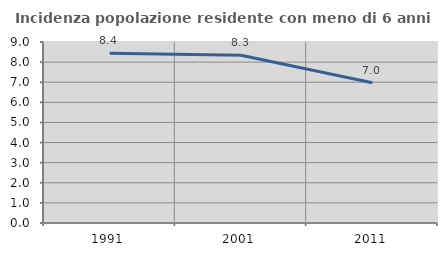
| Category | Incidenza popolazione residente con meno di 6 anni |
|---|---|
| 1991.0 | 8.435 |
| 2001.0 | 8.342 |
| 2011.0 | 6.978 |